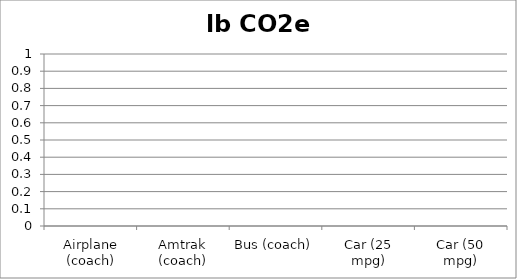
| Category | lb CO2e |
|---|---|
| Airplane (coach) | 0 |
| Amtrak (coach) | 0 |
| Bus (coach) | 0 |
| Car (25 mpg) | 0 |
| Car (50 mpg) | 0 |